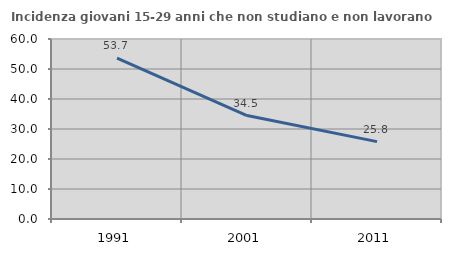
| Category | Incidenza giovani 15-29 anni che non studiano e non lavorano  |
|---|---|
| 1991.0 | 53.659 |
| 2001.0 | 34.489 |
| 2011.0 | 25.79 |